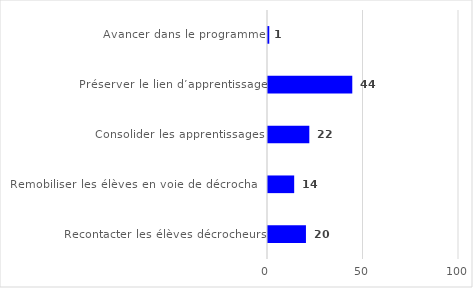
| Category | Series 0 |
|---|---|
| Avancer dans le programme | 0.663 |
| Préserver le lien d’apprentissage | 44.127 |
| Consolider les apprentissages | 21.633 |
| Remobiliser les élèves en voie de décrochage | 13.71 |
| Recontacter les élèves décrocheurs | 19.867 |